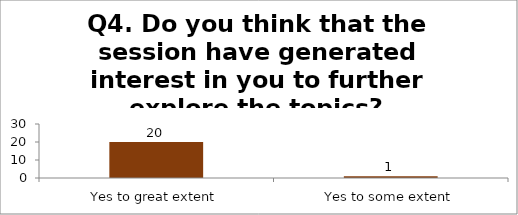
| Category | Q4. Do you think that the session have generated interest in you to further explore the topics? |
|---|---|
| Yes to great extent | 20 |
| Yes to some extent | 1 |